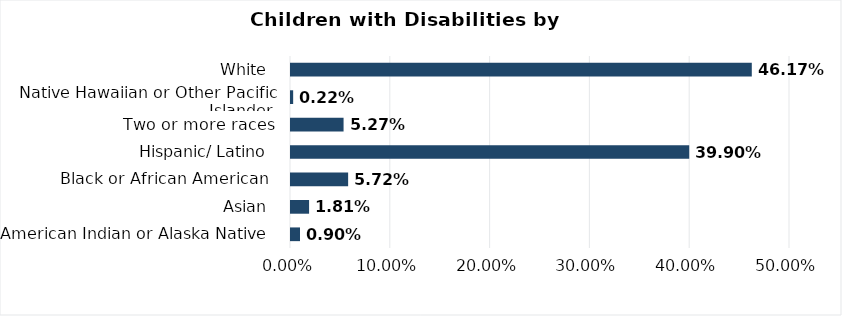
| Category | Series 0 |
|---|---|
| American Indian or Alaska Native  | 0.009 |
| Asian  | 0.018 |
| Black or African American  | 0.057 |
| Hispanic/ Latino  | 0.399 |
| Two or more races | 0.053 |
| Native Hawaiian or Other Pacific Islander  | 0.002 |
| White  | 0.462 |